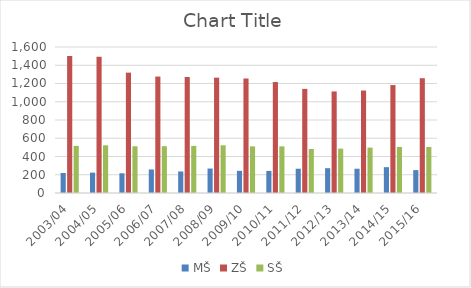
| Category | MŠ | ZŠ | SŠ |
|---|---|---|---|
| 2003/04 | 219 | 1501 | 516 |
| 2004/05 | 223 | 1493 | 523 |
| 2005/06 | 216 | 1319 | 512 |
| 2006/07 | 258 | 1276 | 513 |
| 2007/08 | 236 | 1271 | 516 |
| 2008/09 | 268 | 1264 | 523 |
| 2009/10 | 243 | 1255 | 511 |
| 2010/11 | 242 | 1216 | 511 |
| 2011/12 | 266 | 1141 | 482 |
| 2012/13 | 272 | 1113 | 486 |
| 2013/14 | 266 | 1123 | 497 |
| 2014/15 | 283 | 1183 | 505 |
| 2015/16 | 251 | 1258 | 504 |